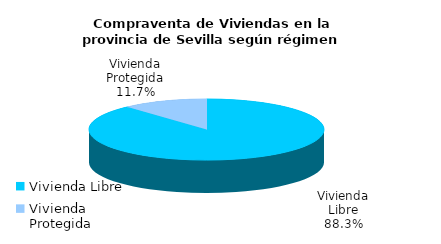
| Category | Series 0 | Series 1 |
|---|---|---|
| Vivienda Libre | 1211 | 0.883 |
| Vivienda Protegida | 161 | 0.117 |